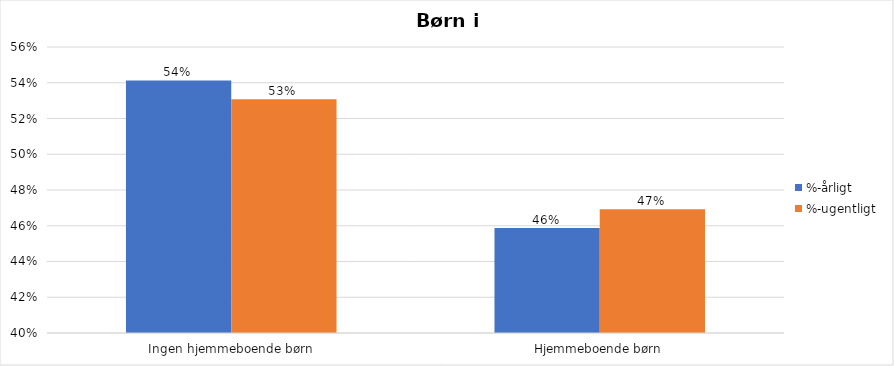
| Category | %-årligt | %-ugentligt |
|---|---|---|
| Ingen hjemmeboende børn | 0.541 | 0.531 |
| Hjemmeboende børn | 0.459 | 0.469 |